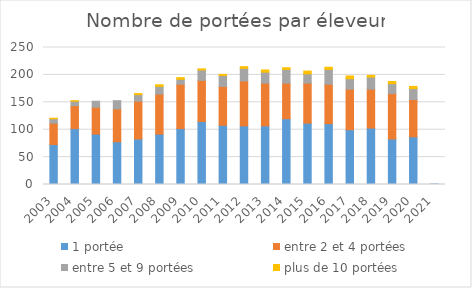
| Category | 1 portée | entre 2 et 4 portées | entre 5 et 9 portées | plus de 10 portées |
|---|---|---|---|---|
| 2003.0 | 73 | 39 | 8 | 1 |
| 2004.0 | 102 | 42 | 8 | 1 |
| 2005.0 | 92 | 49 | 11 | 0 |
| 2006.0 | 78 | 60 | 15 | 0 |
| 2007.0 | 83 | 69 | 12 | 2 |
| 2008.0 | 92 | 73 | 14 | 3 |
| 2009.0 | 102 | 81 | 9 | 3 |
| 2010.0 | 115 | 75 | 19 | 2 |
| 2011.0 | 108 | 71 | 20 | 2 |
| 2012.0 | 107 | 82 | 23 | 3 |
| 2013.0 | 107 | 78 | 20 | 4 |
| 2014.0 | 120 | 65 | 25 | 3 |
| 2015.0 | 112 | 73 | 17 | 5 |
| 2016.0 | 111 | 72 | 27 | 4 |
| 2017.0 | 100 | 74 | 19 | 5 |
| 2018.0 | 103 | 71 | 22 | 3 |
| 2019.0 | 83 | 83 | 18 | 4 |
| 2020.0 | 87 | 68 | 20 | 4 |
| 2021.0 | 1 | 0 | 0 | 0 |